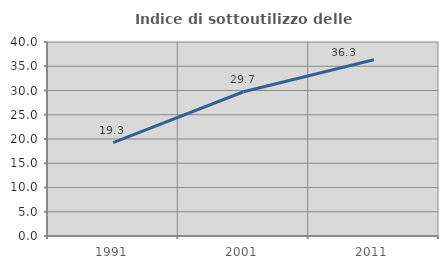
| Category | Indice di sottoutilizzo delle abitazioni  |
|---|---|
| 1991.0 | 19.273 |
| 2001.0 | 29.74 |
| 2011.0 | 36.335 |